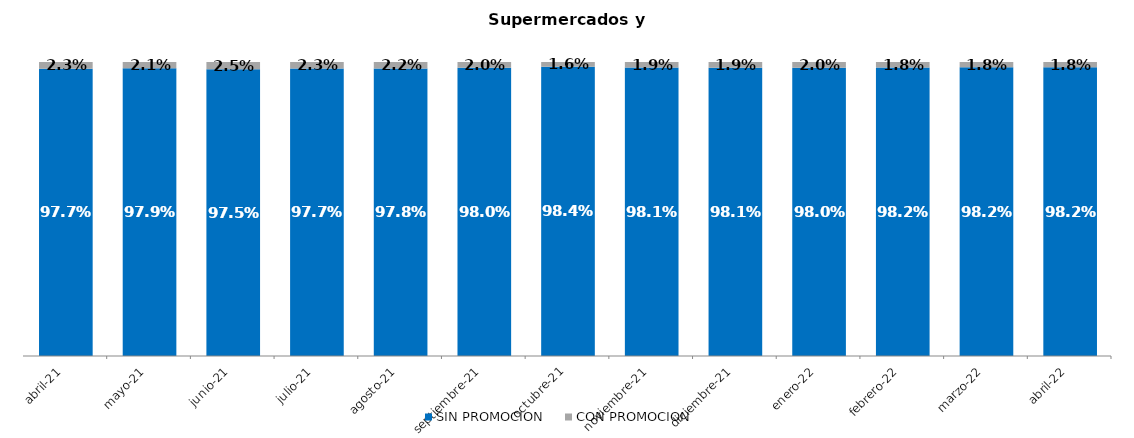
| Category | SIN PROMOCION   | CON PROMOCION   |
|---|---|---|
| 2021-04-01 | 0.977 | 0.023 |
| 2021-05-01 | 0.979 | 0.021 |
| 2021-06-01 | 0.975 | 0.025 |
| 2021-07-01 | 0.977 | 0.023 |
| 2021-08-01 | 0.978 | 0.022 |
| 2021-09-01 | 0.98 | 0.02 |
| 2021-10-01 | 0.984 | 0.016 |
| 2021-11-01 | 0.981 | 0.019 |
| 2021-12-01 | 0.981 | 0.019 |
| 2022-01-01 | 0.98 | 0.02 |
| 2022-02-01 | 0.982 | 0.018 |
| 2022-03-01 | 0.982 | 0.018 |
| 2022-04-01 | 0.982 | 0.018 |